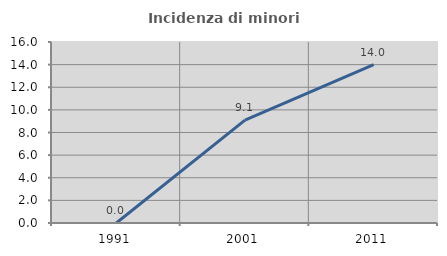
| Category | Incidenza di minori stranieri |
|---|---|
| 1991.0 | 0 |
| 2001.0 | 9.091 |
| 2011.0 | 14 |